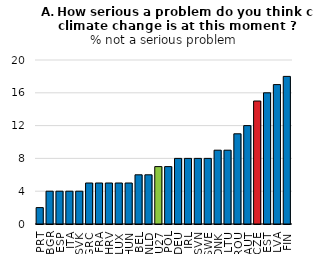
| Category | Series 1 |
|---|---|
| PRT | 2 |
| BGR | 4 |
| ESP | 4 |
| ITA | 4 |
| SVK | 4 |
| GRC | 5 |
| FRA | 5 |
| HRV | 5 |
| LUX | 5 |
| HUN | 5 |
| BEL | 6 |
| NLD | 6 |
| EU27 | 7 |
| POL | 7 |
| DEU | 8 |
| IRL | 8 |
| SVN | 8 |
| SWE | 8 |
| DNK | 9 |
| LTU | 9 |
| ROU | 11 |
| AUT | 12 |
| CZE | 15 |
| EST | 16 |
| LVA | 17 |
| FIN | 18 |